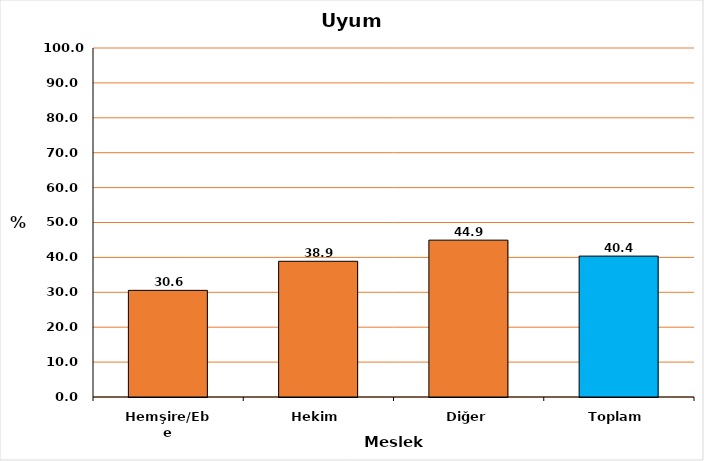
| Category | Series 0 |
|---|---|
| Hemşire/Ebe | 30.556 |
| Hekim | 38.889 |
| Diğer | 44.944 |
| Toplam | 40.373 |